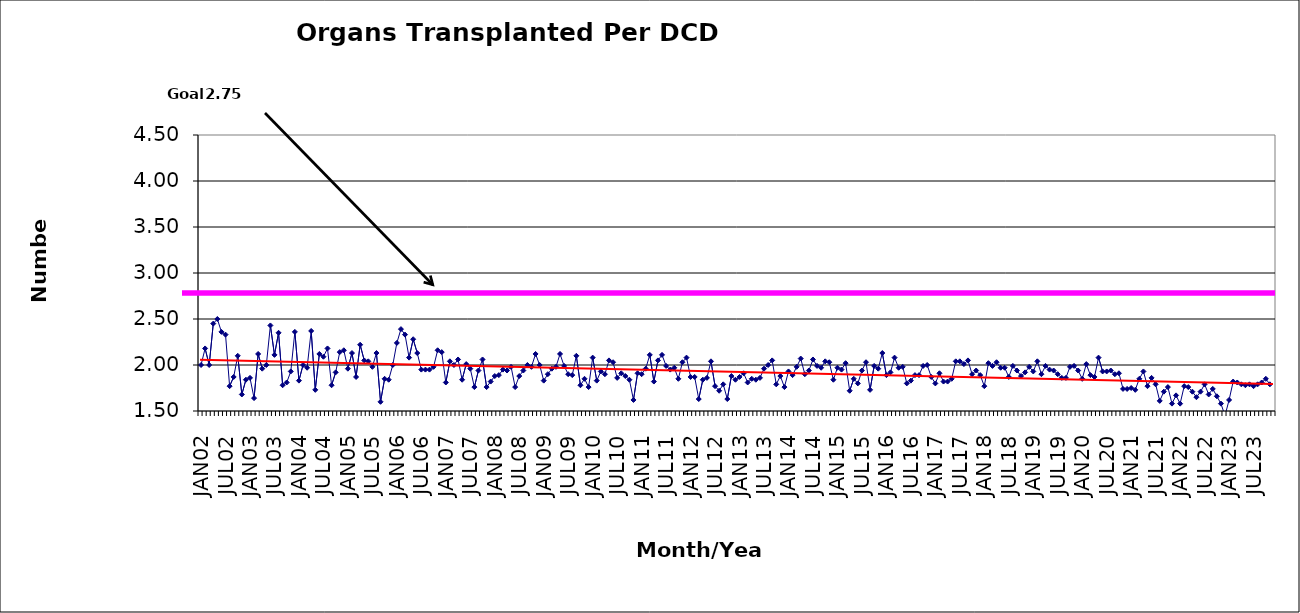
| Category | Series 0 |
|---|---|
| JAN02 | 2 |
| FEB02 | 2.18 |
| MAR02 | 2 |
| APR02 | 2.45 |
| MAY02 | 2.5 |
| JUN02 | 2.36 |
| JUL02 | 2.33 |
| AUG02 | 1.77 |
| SEP02 | 1.87 |
| OCT02 | 2.1 |
| NOV02 | 1.68 |
| DEC02 | 1.84 |
| JAN03 | 1.86 |
| FEB03 | 1.64 |
| MAR03 | 2.12 |
| APR03 | 1.96 |
| MAY03 | 2 |
| JUN03 | 2.43 |
| JUL03 | 2.11 |
| AUG03 | 2.35 |
| SEP03 | 1.78 |
| OCT03 | 1.81 |
| NOV03 | 1.93 |
| DEC03 | 2.36 |
| JAN04 | 1.83 |
| FEB04 | 2 |
| MAR04 | 1.97 |
| APR04 | 2.37 |
| MAY04 | 1.73 |
| JUN04 | 2.12 |
| JUL04 | 2.09 |
| AUG04 | 2.18 |
| SEP04 | 1.78 |
| OCT04 | 1.92 |
| NOV04 | 2.14 |
| DEC04 | 2.16 |
| JAN05 | 1.96 |
| FEB05 | 2.13 |
| MAR05 | 1.87 |
| APR05 | 2.22 |
| MAY05 | 2.05 |
| JUN05 | 2.04 |
| JUL05 | 1.98 |
| AUG05 | 2.13 |
| SEP05 | 1.6 |
| OCT05 | 1.85 |
| NOV05 | 1.84 |
| DEC05 | 2 |
| JAN06 | 2.24 |
| FEB06 | 2.39 |
| MAR06 | 2.33 |
| APR06 | 2.08 |
| MAY06 | 2.28 |
| JUN06 | 2.13 |
| JUL06 | 1.95 |
| AUG06 | 1.95 |
| SEP06 | 1.95 |
| OCT06 | 1.98 |
| NOV06 | 2.16 |
| DEC06 | 2.14 |
| JAN07 | 1.81 |
| FEB07 | 2.04 |
| MAR07 | 2 |
| APR07 | 2.06 |
| MAY07 | 1.84 |
| JUN07 | 2.01 |
| JUL07 | 1.96 |
| AUG07 | 1.76 |
| SEP07 | 1.94 |
| OCT07 | 2.06 |
| NOV07 | 1.76 |
| DEC07 | 1.82 |
| JAN08 | 1.88 |
| FEB08 | 1.89 |
| MAR08 | 1.95 |
| APR08 | 1.94 |
| MAY08 | 1.98 |
| JUN08 | 1.76 |
| JUL08 | 1.88 |
| AUG08 | 1.94 |
| SEP08 | 2 |
| OCT08 | 1.98 |
| NOV08 | 2.12 |
| DEC08 | 2 |
| JAN09 | 1.83 |
| FEB09 | 1.9 |
| MAR09 | 1.96 |
| APR09 | 1.98 |
| MAY09 | 2.12 |
| JUN09 | 1.99 |
| JUL09 | 1.9 |
| AUG09 | 1.89 |
| SEP09 | 2.1 |
| OCT09 | 1.78 |
| NOV09 | 1.85 |
| DEC09 | 1.76 |
| JAN10 | 2.08 |
| FEB10 | 1.83 |
| MAR10 | 1.93 |
| APR10 | 1.9 |
| MAY10 | 2.05 |
| JUN10 | 2.03 |
| JUL10 | 1.86 |
| AUG10 | 1.91 |
| SEP10 | 1.88 |
| OCT10 | 1.84 |
| NOV10 | 1.62 |
| DEC10 | 1.91 |
| JAN11 | 1.9 |
| FEB11 | 1.96 |
| MAR11 | 2.11 |
| APR11 | 1.82 |
| MAY11 | 2.05 |
| JUN11 | 2.11 |
| JUL11 | 1.99 |
| AUG11 | 1.95 |
| SEP11 | 1.97 |
| OCT11 | 1.85 |
| NOV11 | 2.03 |
| DEC11 | 2.08 |
| JAN12 | 1.87 |
| FEB12 | 1.87 |
| MAR12 | 1.63 |
| APR12 | 1.84 |
| MAY12 | 1.86 |
| JUN12 | 2.04 |
| JUL12 | 1.77 |
| AUG12 | 1.72 |
| SEP12 | 1.79 |
| OCT12 | 1.63 |
| NOV12 | 1.88 |
| DEC12 | 1.84 |
| JAN13 | 1.87 |
| FEB13 | 1.91 |
| MAR13 | 1.81 |
| APR13 | 1.85 |
| MAY13 | 1.84 |
| JUN13 | 1.86 |
| JUL13 | 1.96 |
| AUG13 | 2 |
| SEP13 | 2.05 |
| OCT13 | 1.79 |
| NOV13 | 1.88 |
| DEC13 | 1.76 |
| JAN14 | 1.93 |
| FEB14 | 1.89 |
| MAR14 | 1.98 |
| APR14 | 2.07 |
| MAY14 | 1.9 |
| JUN14 | 1.94 |
| JUL14 | 2.06 |
| AUG14 | 1.99 |
| SEP14 | 1.97 |
| OCT14 | 2.04 |
| NOV14 | 2.03 |
| DEC14 | 1.84 |
| JAN15 | 1.97 |
| FEB15 | 1.95 |
| MAR15 | 2.02 |
| APR15 | 1.72 |
| MAY15 | 1.85 |
| JUN15 | 1.8 |
| JUL15 | 1.94 |
| AUG15 | 2.03 |
| SEP15 | 1.73 |
| OCT15 | 1.99 |
| NOV15 | 1.96 |
| DEC15 | 2.13 |
| JAN16 | 1.89 |
| FEB16 | 1.92 |
| MAR16 | 2.08 |
| APR16 | 1.97 |
| MAY16 | 1.98 |
| JUN16 | 1.8 |
| JUL16 | 1.83 |
| AUG16 | 1.89 |
| SEP16 | 1.89 |
| OCT16 | 1.99 |
| NOV16 | 2 |
| DEC16 | 1.87 |
| JAN17 | 1.8 |
| FEB17 | 1.91 |
| MAR17 | 1.82 |
| APR17 | 1.82 |
| MAY17 | 1.85 |
| JUN17 | 2.04 |
| JUL17 | 2.04 |
| AUG17 | 2.01 |
| SEP17 | 2.05 |
| OCT17 | 1.9 |
| NOV17 | 1.94 |
| DEC17 | 1.89 |
| JAN18 | 1.77 |
| FEB18 | 2.02 |
| MAR18 | 1.99 |
| APR18 | 2.03 |
| MAY18 | 1.97 |
| JUN18 | 1.97 |
| JUL18 | 1.87 |
| AUG18 | 1.99 |
| SEP18 | 1.94 |
| OCT18 | 1.88 |
| NOV18 | 1.92 |
| DEC18 | 1.98 |
| JAN19 | 1.93 |
| FEB19 | 2.04 |
| MAR19 | 1.9 |
| APR19 | 1.99 |
| MAY19 | 1.95 |
| JUN19 | 1.94 |
| JUL19 | 1.9 |
| AUG19 | 1.86 |
| SEP19 | 1.86 |
| OCT19 | 1.98 |
| NOV19 | 1.99 |
| DEC19 | 1.94 |
| JAN20 | 1.85 |
| FEB20 | 2.01 |
| MAR20 | 1.89 |
| APR20 | 1.87 |
| MAY20 | 2.08 |
| JUN20 | 1.93 |
| JUL20 | 1.93 |
| AUG20 | 1.94 |
| SEP20 | 1.9 |
| OCT20 | 1.91 |
| NOV20 | 1.74 |
| DEC20 | 1.74 |
| JAN21 | 1.75 |
| FEB21 | 1.73 |
| MAR21 | 1.85 |
| APR21 | 1.93 |
| MAY21 | 1.77 |
| JUN21 | 1.86 |
| JUL21 | 1.79 |
| AUG21 | 1.61 |
| SEP21 | 1.71 |
| OCT21 | 1.76 |
| NOV21 | 1.58 |
| DEC21 | 1.67 |
| JAN22 | 1.58 |
| FEB22 | 1.77 |
| MAR22 | 1.76 |
| APR22 | 1.71 |
| MAY22 | 1.65 |
| JUN22 | 1.71 |
| JUL22 | 1.79 |
| AUG22 | 1.68 |
| SEP22 | 1.74 |
| OCT22 | 1.66 |
| NOV22 | 1.58 |
| DEC22 | 1.45 |
| JAN23 | 1.62 |
| FEB23 | 1.82 |
| MAR23 | 1.81 |
| APR23 | 1.79 |
| MAY23 | 1.78 |
| JUN23 | 1.79 |
| JUL23 | 1.77 |
| AUG23 | 1.79 |
| SEP23 | 1.81 |
| OCT23 | 1.85 |
| NOV23 | 1.79 |